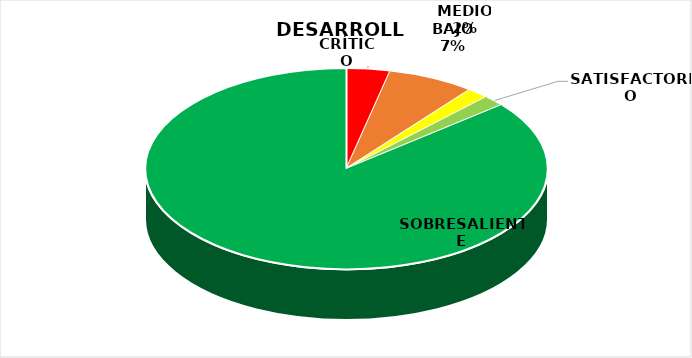
| Category | Series 2 | Series 1 | Series 0 |
|---|---|---|---|
| CRÍTICO | 2 | 0 | 2 |
| BAJO | 4 | 2 | 4 |
| MEDIO | 1 | 8 | 1 |
| SATISFACTORIO | 1 | 2 | 1 |
| SOBRESALIENTE | 49 | 11 | 49 |